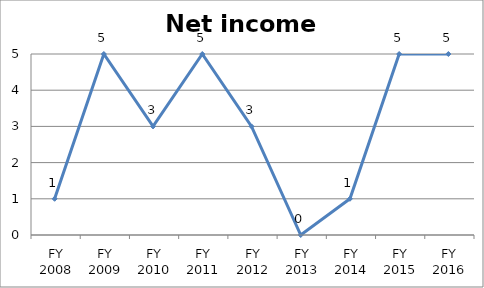
| Category | Net income score |
|---|---|
| FY 2016 | 5 |
| FY 2015 | 5 |
| FY 2014 | 1 |
| FY 2013 | 0 |
| FY 2012 | 3 |
| FY 2011 | 5 |
| FY 2010 | 3 |
| FY 2009 | 5 |
| FY 2008 | 1 |